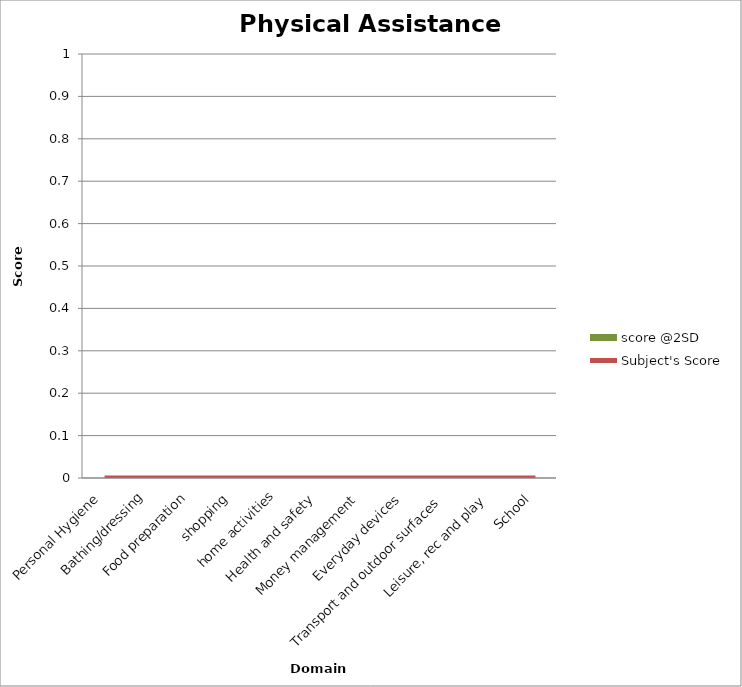
| Category | score @2SD |
|---|---|
| Personal Hygiene | 0 |
| Bathing/dressing | 0 |
| Food preparation | 0 |
| shopping | 0 |
| home activities | 0 |
| Health and safety | 0 |
| Money management | 0 |
| Everyday devices | 0 |
| Transport and outdoor surfaces | 0 |
| Leisure, rec and play | 0 |
| School | 0 |